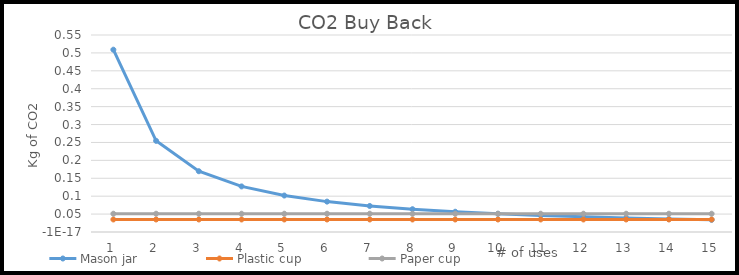
| Category | Mason jar | Plastic cup | Paper cup |
|---|---|---|---|
| 0 | 0.509 | 0.035 | 0.051 |
| 1 | 0.254 | 0.035 | 0.051 |
| 2 | 0.17 | 0.035 | 0.051 |
| 3 | 0.127 | 0.035 | 0.051 |
| 4 | 0.102 | 0.035 | 0.051 |
| 5 | 0.085 | 0.035 | 0.051 |
| 6 | 0.073 | 0.035 | 0.051 |
| 7 | 0.064 | 0.035 | 0.051 |
| 8 | 0.057 | 0.035 | 0.051 |
| 9 | 0.051 | 0.035 | 0.051 |
| 10 | 0.046 | 0.035 | 0.051 |
| 11 | 0.042 | 0.035 | 0.051 |
| 12 | 0.039 | 0.035 | 0.051 |
| 13 | 0.036 | 0.035 | 0.051 |
| 14 | 0.034 | 0.035 | 0.051 |